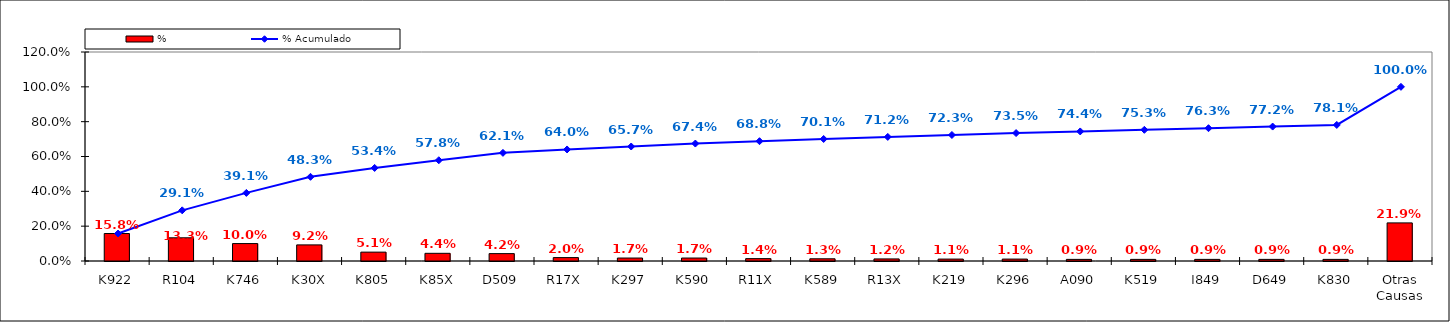
| Category | % |
|---|---|
| K922 | 0.158 |
| R104 | 0.133 |
| K746 | 0.1 |
| K30X | 0.092 |
| K805 | 0.051 |
| K85X | 0.044 |
| D509 | 0.042 |
| R17X | 0.02 |
| K297 | 0.017 |
| K590 | 0.017 |
| R11X | 0.014 |
| K589 | 0.013 |
| R13X | 0.012 |
| K219 | 0.011 |
| K296 | 0.011 |
| A090 | 0.009 |
| K519 | 0.009 |
| I849 | 0.009 |
| D649 | 0.009 |
| K830 | 0.009 |
| Otras Causas | 0.219 |